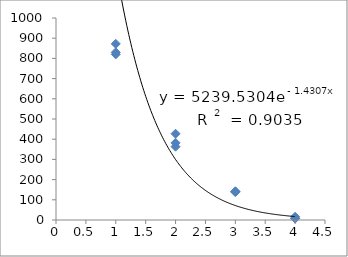
| Category | Series 0 |
|---|---|
| 1.0 | 872 |
| 1.0 | 820 |
| 1.0 | 830 |
| 2.0 | 382 |
| 2.0 | 427 |
| 2.0 | 363 |
| 3.0 | 138 |
| 3.0 | 142 |
| 3.0 | 141 |
| 4.0 | 16 |
| 4.0 | 7 |
| 4.0 | 9 |